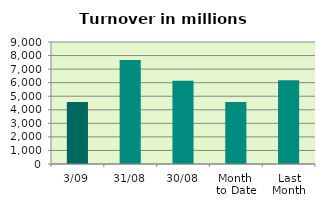
| Category | Series 0 |
|---|---|
| 3/09 | 4575.238 |
| 31/08 | 7663.04 |
| 30/08 | 6137.702 |
| Month 
to Date | 4575.238 |
| Last
Month | 6185.877 |